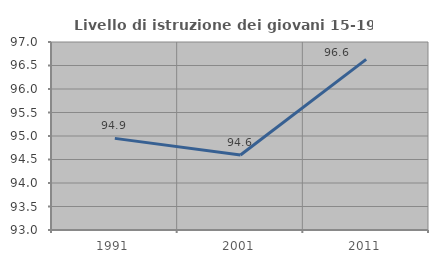
| Category | Livello di istruzione dei giovani 15-19 anni |
|---|---|
| 1991.0 | 94.949 |
| 2001.0 | 94.595 |
| 2011.0 | 96.629 |